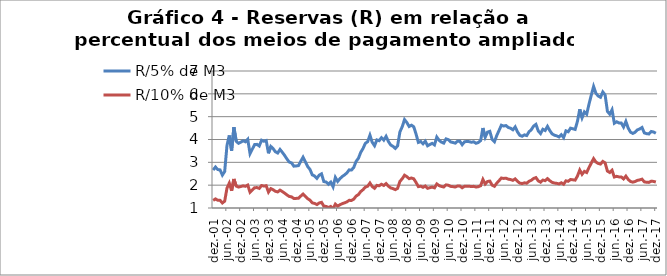
| Category | R/5% de M3 | R/10% de M3 |
|---|---|---|
| 2001-12-01 | 2.662 | 1.331 |
| 2002-01-01 | 2.794 | 1.397 |
| 2002-02-01 | 2.682 | 1.341 |
| 2002-03-01 | 2.67 | 1.335 |
| 2002-04-01 | 2.441 | 1.221 |
| 2002-05-01 | 2.598 | 1.299 |
| 2002-06-01 | 3.741 | 1.87 |
| 2002-07-01 | 4.178 | 2.089 |
| 2002-08-01 | 3.507 | 1.753 |
| 2002-09-01 | 4.539 | 2.269 |
| 2002-10-01 | 3.924 | 1.962 |
| 2002-11-01 | 3.832 | 1.916 |
| 2002-12-01 | 3.882 | 1.941 |
| 2003-01-01 | 3.943 | 1.971 |
| 2003-02-01 | 3.9 | 1.95 |
| 2003-03-01 | 4.01 | 2.005 |
| 2003-04-01 | 3.379 | 1.69 |
| 2003-05-01 | 3.581 | 1.79 |
| 2003-06-01 | 3.78 | 1.89 |
| 2003-07-01 | 3.787 | 1.894 |
| 2003-08-01 | 3.716 | 1.858 |
| 2003-09-01 | 3.968 | 1.984 |
| 2003-10-01 | 3.921 | 1.961 |
| 2003-11-01 | 3.955 | 1.977 |
| 2003-12-01 | 3.397 | 1.698 |
| 2004-01-01 | 3.697 | 1.848 |
| 2004-02-01 | 3.6 | 1.8 |
| 2004-03-01 | 3.462 | 1.731 |
| 2004-04-01 | 3.409 | 1.704 |
| 2004-05-01 | 3.565 | 1.783 |
| 2004-06-01 | 3.44 | 1.72 |
| 2004-07-01 | 3.302 | 1.651 |
| 2004-08-01 | 3.146 | 1.573 |
| 2004-09-01 | 3.013 | 1.506 |
| 2004-10-01 | 2.974 | 1.487 |
| 2004-11-01 | 2.832 | 1.416 |
| 2004-12-01 | 2.842 | 1.421 |
| 2005-01-01 | 2.856 | 1.428 |
| 2005-02-01 | 3.045 | 1.522 |
| 2005-03-01 | 3.225 | 1.612 |
| 2005-04-01 | 3.022 | 1.511 |
| 2005-05-01 | 2.815 | 1.408 |
| 2005-06-01 | 2.688 | 1.344 |
| 2005-07-01 | 2.449 | 1.224 |
| 2005-08-01 | 2.402 | 1.201 |
| 2005-09-01 | 2.3 | 1.15 |
| 2005-10-01 | 2.44 | 1.22 |
| 2005-11-01 | 2.496 | 1.248 |
| 2005-12-01 | 2.158 | 1.079 |
| 2006-01-01 | 2.138 | 1.069 |
| 2006-02-01 | 2.039 | 1.02 |
| 2006-03-01 | 2.134 | 1.067 |
| 2006-04-01 | 1.927 | 0.964 |
| 2006-05-01 | 2.34 | 1.17 |
| 2006-06-01 | 2.165 | 1.082 |
| 2006-07-01 | 2.286 | 1.143 |
| 2006-08-01 | 2.381 | 1.19 |
| 2006-09-01 | 2.451 | 1.225 |
| 2006-10-01 | 2.537 | 1.268 |
| 2006-11-01 | 2.671 | 1.335 |
| 2006-12-01 | 2.663 | 1.332 |
| 2007-01-01 | 2.781 | 1.39 |
| 2007-02-01 | 3.043 | 1.522 |
| 2007-03-01 | 3.176 | 1.588 |
| 2007-04-01 | 3.438 | 1.719 |
| 2007-05-01 | 3.606 | 1.803 |
| 2007-06-01 | 3.831 | 1.915 |
| 2007-07-01 | 3.904 | 1.952 |
| 2007-08-01 | 4.186 | 2.093 |
| 2007-09-01 | 3.877 | 1.939 |
| 2007-10-01 | 3.729 | 1.864 |
| 2007-11-01 | 3.982 | 1.991 |
| 2007-12-01 | 3.948 | 1.974 |
| 2008-01-01 | 4.08 | 2.04 |
| 2008-02-01 | 3.973 | 1.987 |
| 2008-03-01 | 4.138 | 2.069 |
| 2008-04-01 | 3.913 | 1.957 |
| 2008-05-01 | 3.759 | 1.88 |
| 2008-06-01 | 3.699 | 1.85 |
| 2008-07-01 | 3.609 | 1.804 |
| 2008-08-01 | 3.72 | 1.86 |
| 2008-09-01 | 4.334 | 2.167 |
| 2008-10-01 | 4.559 | 2.28 |
| 2008-11-01 | 4.871 | 2.436 |
| 2008-12-01 | 4.745 | 2.372 |
| 2009-01-01 | 4.571 | 2.285 |
| 2009-02-01 | 4.627 | 2.314 |
| 2009-03-01 | 4.557 | 2.279 |
| 2009-04-01 | 4.238 | 2.119 |
| 2009-05-01 | 3.872 | 1.936 |
| 2009-06-01 | 3.911 | 1.956 |
| 2009-07-01 | 3.81 | 1.905 |
| 2009-08-01 | 3.926 | 1.963 |
| 2009-09-01 | 3.724 | 1.862 |
| 2009-10-01 | 3.781 | 1.891 |
| 2009-11-01 | 3.832 | 1.916 |
| 2009-12-01 | 3.763 | 1.882 |
| 2010-01-01 | 4.106 | 2.053 |
| 2010-02-01 | 3.963 | 1.981 |
| 2010-03-01 | 3.886 | 1.943 |
| 2010-04-01 | 3.841 | 1.921 |
| 2010-05-01 | 4.026 | 2.013 |
| 2010-06-01 | 3.992 | 1.996 |
| 2010-07-01 | 3.893 | 1.946 |
| 2010-08-01 | 3.87 | 1.935 |
| 2010-09-01 | 3.839 | 1.92 |
| 2010-10-01 | 3.927 | 1.964 |
| 2010-11-01 | 3.922 | 1.961 |
| 2010-12-01 | 3.772 | 1.886 |
| 2011-01-01 | 3.899 | 1.949 |
| 2011-02-01 | 3.916 | 1.958 |
| 2011-03-01 | 3.906 | 1.953 |
| 2011-04-01 | 3.879 | 1.939 |
| 2011-05-01 | 3.898 | 1.949 |
| 2011-06-01 | 3.834 | 1.917 |
| 2011-07-01 | 3.869 | 1.934 |
| 2011-08-01 | 3.952 | 1.976 |
| 2011-09-01 | 4.501 | 2.251 |
| 2011-10-01 | 4.103 | 2.052 |
| 2011-11-01 | 4.322 | 2.161 |
| 2011-12-01 | 4.356 | 2.178 |
| 2012-01-01 | 4.001 | 2.001 |
| 2012-02-01 | 3.9 | 1.95 |
| 2012-03-01 | 4.174 | 2.087 |
| 2012-04-01 | 4.396 | 2.198 |
| 2012-05-01 | 4.626 | 2.313 |
| 2012-06-01 | 4.59 | 2.295 |
| 2012-07-01 | 4.61 | 2.305 |
| 2012-08-01 | 4.526 | 2.263 |
| 2012-09-01 | 4.494 | 2.247 |
| 2012-10-01 | 4.426 | 2.213 |
| 2012-11-01 | 4.552 | 2.276 |
| 2012-12-01 | 4.333 | 2.167 |
| 2013-01-01 | 4.182 | 2.091 |
| 2013-02-01 | 4.141 | 2.071 |
| 2013-03-01 | 4.203 | 2.101 |
| 2013-04-01 | 4.172 | 2.086 |
| 2013-05-01 | 4.338 | 2.169 |
| 2013-06-01 | 4.431 | 2.216 |
| 2013-07-01 | 4.589 | 2.295 |
| 2013-08-01 | 4.663 | 2.331 |
| 2013-09-01 | 4.376 | 2.188 |
| 2013-10-01 | 4.261 | 2.131 |
| 2013-11-01 | 4.449 | 2.224 |
| 2013-12-01 | 4.395 | 2.197 |
| 2014-01-01 | 4.574 | 2.287 |
| 2014-02-01 | 4.391 | 2.196 |
| 2014-03-01 | 4.247 | 2.124 |
| 2014-04-01 | 4.188 | 2.094 |
| 2014-05-01 | 4.16 | 2.08 |
| 2014-06-01 | 4.111 | 2.055 |
| 2014-07-01 | 4.209 | 2.105 |
| 2014-08-01 | 4.081 | 2.041 |
| 2014-09-01 | 4.38 | 2.19 |
| 2014-10-01 | 4.339 | 2.169 |
| 2014-11-01 | 4.495 | 2.248 |
| 2014-12-01 | 4.47 | 2.235 |
| 2015-01-01 | 4.442 | 2.221 |
| 2015-02-01 | 4.799 | 2.4 |
| 2015-03-01 | 5.324 | 2.662 |
| 2015-04-01 | 4.952 | 2.476 |
| 2015-05-01 | 5.207 | 2.604 |
| 2015-06-01 | 5.105 | 2.553 |
| 2015-07-01 | 5.545 | 2.773 |
| 2015-08-01 | 5.941 | 2.971 |
| 2015-09-01 | 6.322 | 3.161 |
| 2015-10-01 | 6.027 | 3.014 |
| 2015-11-01 | 5.904 | 2.952 |
| 2015-12-01 | 5.848 | 2.924 |
| 2016-01-01 | 6.082 | 3.041 |
| 2016-02-01 | 5.949 | 2.974 |
| 2016-03-01 | 5.232 | 2.616 |
| 2016-04-01 | 5.112 | 2.556 |
| 2016-05-01 | 5.303 | 2.651 |
| 2016-06-01 | 4.712 | 2.356 |
| 2016-07-01 | 4.776 | 2.388 |
| 2016-08-01 | 4.725 | 2.362 |
| 2016-09-01 | 4.722 | 2.361 |
| 2016-10-01 | 4.547 | 2.273 |
| 2016-11-01 | 4.792 | 2.396 |
| 2016-12-01 | 4.502 | 2.251 |
| 2017-01-01 | 4.323 | 2.161 |
| 2017-02-01 | 4.267 | 2.133 |
| 2017-03-01 | 4.319 | 2.159 |
| 2017-04-01 | 4.42 | 2.21 |
| 2017-05-01 | 4.463 | 2.231 |
| 2017-06-01 | 4.526 | 2.263 |
| 2017-07-01 | 4.289 | 2.144 |
| 2017-08-01 | 4.256 | 2.128 |
| 2017-09-01 | 4.243 | 2.121 |
| 2017-10-01 | 4.352 | 2.176 |
| 2017-11-01 | 4.328 | 2.164 |
| 2017-12-01 | 4.274 | 2.137 |